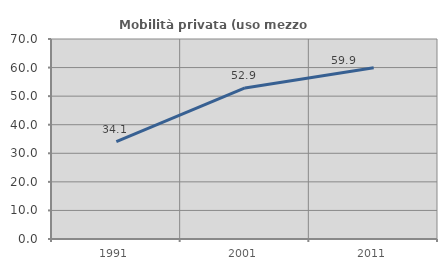
| Category | Mobilità privata (uso mezzo privato) |
|---|---|
| 1991.0 | 34.078 |
| 2001.0 | 52.878 |
| 2011.0 | 59.919 |